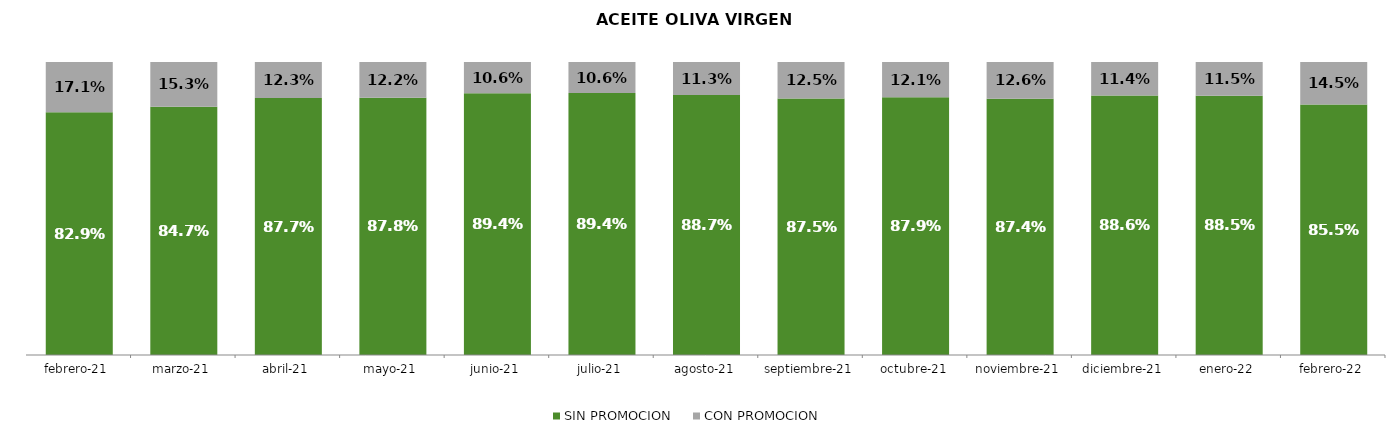
| Category | SIN PROMOCION   | CON PROMOCION   |
|---|---|---|
| 2021-02-01 | 0.829 | 0.171 |
| 2021-03-01 | 0.847 | 0.153 |
| 2021-04-01 | 0.877 | 0.123 |
| 2021-05-01 | 0.878 | 0.122 |
| 2021-06-01 | 0.894 | 0.106 |
| 2021-07-01 | 0.894 | 0.106 |
| 2021-08-01 | 0.887 | 0.113 |
| 2021-09-01 | 0.875 | 0.125 |
| 2021-10-01 | 0.879 | 0.121 |
| 2021-11-01 | 0.874 | 0.126 |
| 2021-12-01 | 0.886 | 0.114 |
| 2022-01-01 | 0.885 | 0.115 |
| 2022-02-01 | 0.855 | 0.145 |